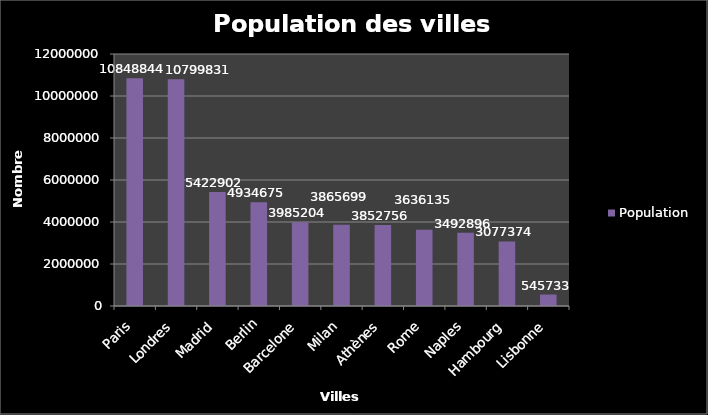
| Category | Population |
|---|---|
| Paris | 10848844 |
| Londres | 10799831 |
| Madrid | 5422902 |
| Berlin | 4934675 |
| Barcelone | 3985204 |
| Milan | 3865699 |
| Athènes | 3852756 |
| Rome | 3636135 |
| Naples | 3492896 |
| Hambourg | 3077374 |
| Lisbonne | 545733 |